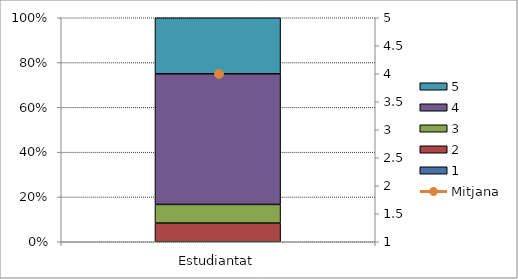
| Category | 1 | 2 | 3 | 4 | 5 |
|---|---|---|---|---|---|
| Estudiantat | 0 | 1 | 1 | 7 | 3 |